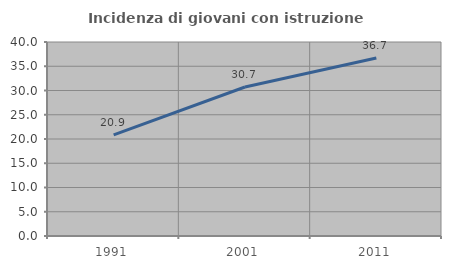
| Category | Incidenza di giovani con istruzione universitaria |
|---|---|
| 1991.0 | 20.858 |
| 2001.0 | 30.724 |
| 2011.0 | 36.697 |